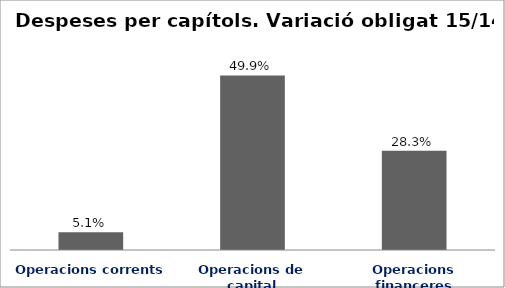
| Category | Series 0 |
|---|---|
| Operacions corrents | 0.051 |
| Operacions de capital | 0.499 |
| Operacions financeres | 0.283 |